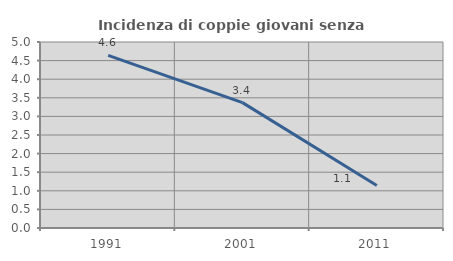
| Category | Incidenza di coppie giovani senza figli |
|---|---|
| 1991.0 | 4.641 |
| 2001.0 | 3.371 |
| 2011.0 | 1.141 |